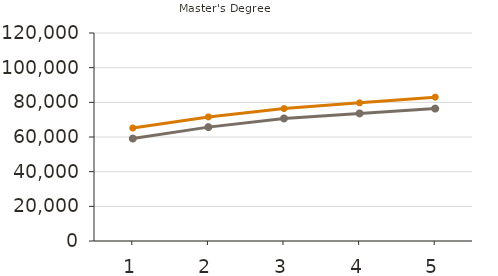
| Category | Mean | Median |
|---|---|---|
| 1.0 | 65200 | 59100 |
| 2.0 | 71600 | 65700 |
| 3.0 | 76400 | 70700 |
| 4.0 | 79700 | 73600 |
| 5.0 | 83000 | 76400 |